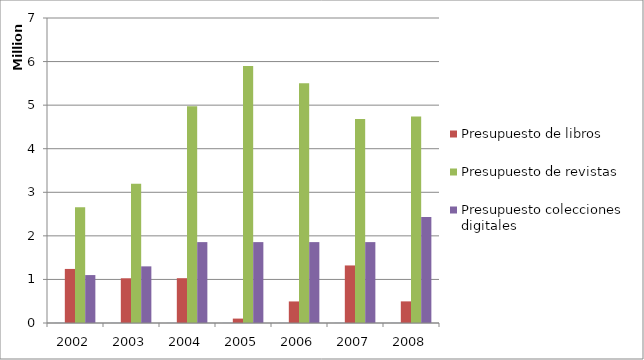
| Category | Año | Presupuesto de libros | Presupuesto de revistas | Presupuesto colecciones digitales |
|---|---|---|---|---|
| 2002.0 | 2002 | 1240886.45 | 2659113.55 | 1100000 |
| 2003.0 | 2003 | 1026295.98 | 3196494.02 | 1300000 |
| 2004.0 | 2004 | 1028235.67 | 4971764.33 | 1856475 |
| 2005.0 | 2005 | 101309.6 | 5898690.4 | 1856475 |
| 2006.0 | 2006 | 494838.97 | 5505161.03 | 1856475 |
| 2007.0 | 2007 | 1320805.75 | 4684712.56 | 1856475 |
| 2008.0 | 2008 | 496221.77 | 4737159 | 2433700 |